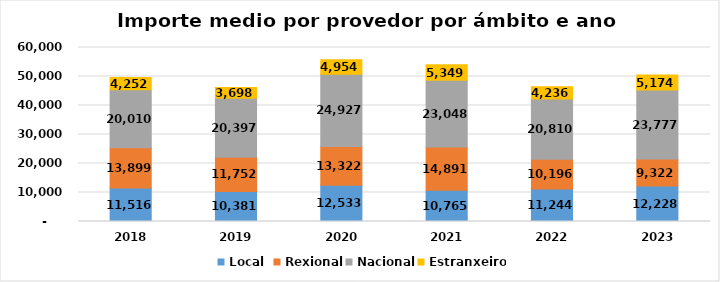
| Category | Local  | Rexional | Nacional | Estranxeiro |
|---|---|---|---|---|
| 2018.0 | 11515.626 | 13898.72 | 20009.856 | 4252.076 |
| 2019.0 | 10380.961 | 11752.278 | 20397.298 | 3697.782 |
| 2020.0 | 12532.996 | 13322.488 | 24926.802 | 4954.425 |
| 2021.0 | 10764.77 | 14891.19 | 23047.83 | 5348.95 |
| 2022.0 | 11243.767 | 10196.298 | 20809.892 | 4235.535 |
| 2023.0 | 12228.024 | 9321.573 | 23776.927 | 5173.732 |